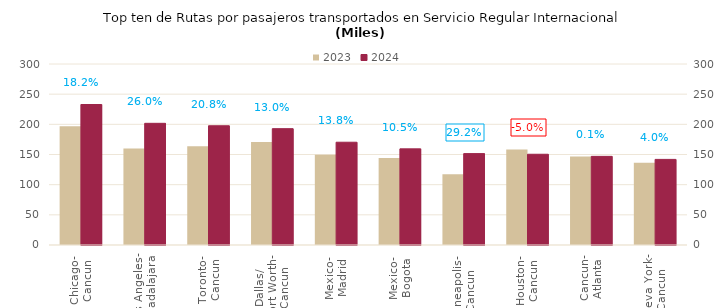
| Category | 2023 | 2024 |
|---|---|---|
| Chicago-
Cancun | 196.97 | 232.856 |
| Los Angeles-
Guadalajara | 160.022 | 201.67 |
| Toronto-
Cancun | 163.653 | 197.65 |
| Dallas/
Fort Worth-
Cancun | 170.713 | 192.83 |
| Mexico-
Madrid | 149.643 | 170.347 |
| Mexico-
Bogota | 144.154 | 159.335 |
| Minneapolis-
Cancun | 117.26 | 151.472 |
| Houston-
Cancun | 158.248 | 150.403 |
| Cancun-
Atlanta | 146.69 | 146.902 |
| Nueva York-
Cancun | 136.429 | 141.882 |